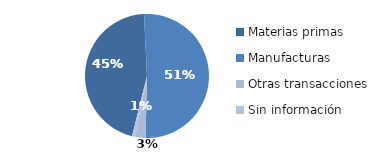
| Category | Series 0 |
|---|---|
| Materias primas | 540.21 |
| Manufacturas | 609.155 |
| Otras transacciones | 32.736 |
| Sin información | 9.185 |